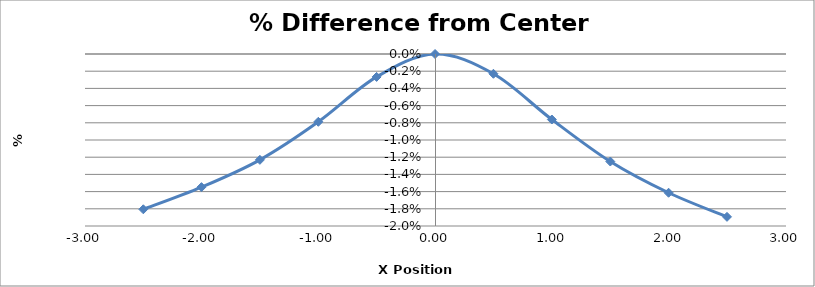
| Category | Series 0 |
|---|---|
| -2.5010000000000003 | -0.018 |
| -2.003 | -0.015 |
| -1.5030000000000001 | -0.012 |
| -1.0030000000000001 | -0.008 |
| -0.5040000000000004 | -0.003 |
| -0.004000000000000448 | 0 |
| 0.49599999999999955 | -0.002 |
| 0.9959999999999996 | -0.008 |
| 1.4959999999999996 | -0.013 |
| 1.995 | -0.016 |
| 2.495 | -0.019 |